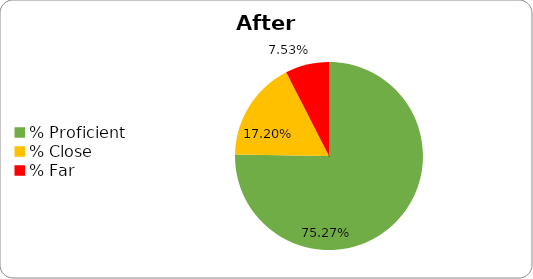
| Category | Series 0 |
|---|---|
| % Proficient | 0.753 |
| % Close | 0.172 |
| % Far | 0.075 |